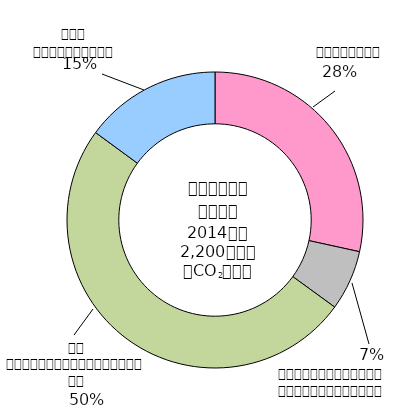
| Category | Series 0 | Series 2 | Series 3 | Series 4 | Series 5 | Series 6 | Series 7 |
|---|---|---|---|---|---|---|---|
| 0 | 0.284 |  |  |  |  |  |  |
| 1 | 0.066 |  |  |  |  |  |  |
| 2 | 0.5 |  |  |  |  |  |  |
| 3 | 0.149 |  |  |  |  |  |  |